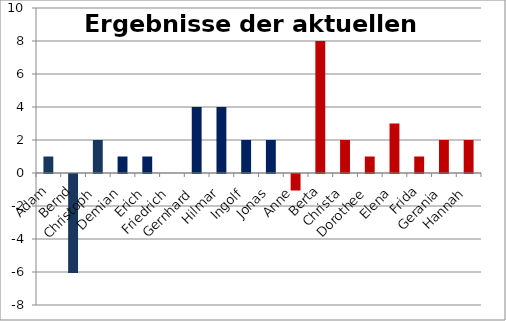
| Category | Series 0 |
|---|---|
| Adam | 1 |
| Bernd | -6 |
| Christoph | 2 |
| Demian | 1 |
| Erich | 1 |
| Friedrich | 0 |
| Gernhard | 4 |
| Hilmar | 4 |
| Ingolf | 2 |
| Jonas | 2 |
| Anne | -1 |
| Berta | 8 |
| Christa | 2 |
| Dorothee | 1 |
| Elena | 3 |
| Frida | 1 |
| Gerania | 2 |
| Hannah | 2 |